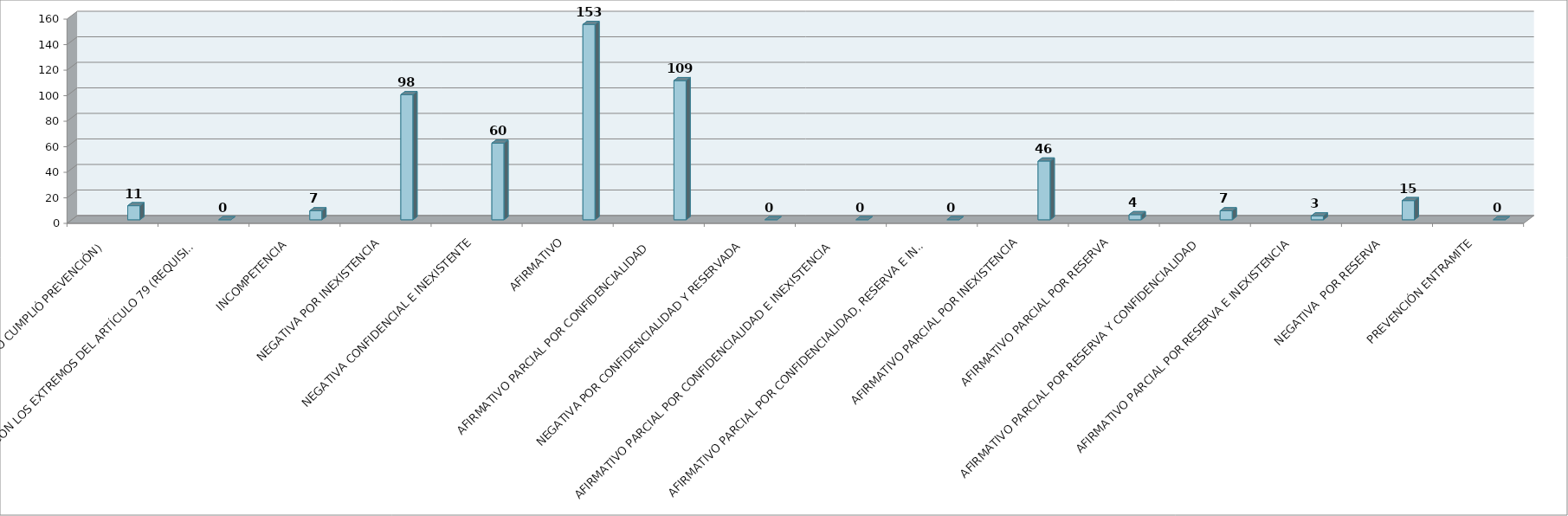
| Category | Series 0 | Series 1 | Series 2 | Series 3 | Series 4 | Series 5 |
|---|---|---|---|---|---|---|
| SE TIENE POR NO PRESENTADA ( NO CUMPLIÓ PREVENCIÓN) |  |  |  |  | 11 |  |
| NO CUMPLIO CON LOS EXTREMOS DEL ARTÍCULO 79 (REQUISITOS) |  |  |  |  | 0 |  |
| INCOMPETENCIA  |  |  |  |  | 7 |  |
| NEGATIVA POR INEXISTENCIA |  |  |  |  | 98 |  |
| NEGATIVA CONFIDENCIAL E INEXISTENTE |  |  |  |  | 60 |  |
| AFIRMATIVO |  |  |  |  | 153 |  |
| AFIRMATIVO PARCIAL POR CONFIDENCIALIDAD  |  |  |  |  | 109 |  |
| NEGATIVA POR CONFIDENCIALIDAD Y RESERVADA |  |  |  |  | 0 |  |
| AFIRMATIVO PARCIAL POR CONFIDENCIALIDAD E INEXISTENCIA |  |  |  |  | 0 |  |
| AFIRMATIVO PARCIAL POR CONFIDENCIALIDAD, RESERVA E INEXISTENCIA |  |  |  |  | 0 |  |
| AFIRMATIVO PARCIAL POR INEXISTENCIA |  |  |  |  | 46 |  |
| AFIRMATIVO PARCIAL POR RESERVA |  |  |  |  | 4 |  |
| AFIRMATIVO PARCIAL POR RESERVA Y CONFIDENCIALIDAD |  |  |  |  | 7 |  |
| AFIRMATIVO PARCIAL POR RESERVA E INEXISTENCIA |  |  |  |  | 3 |  |
| NEGATIVA  POR RESERVA |  |  |  |  | 15 |  |
| PREVENCIÓN ENTRAMITE |  |  |  |  | 0 |  |